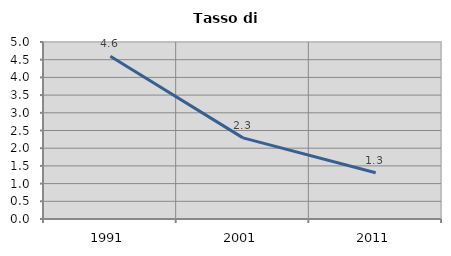
| Category | Tasso di disoccupazione   |
|---|---|
| 1991.0 | 4.6 |
| 2001.0 | 2.292 |
| 2011.0 | 1.306 |